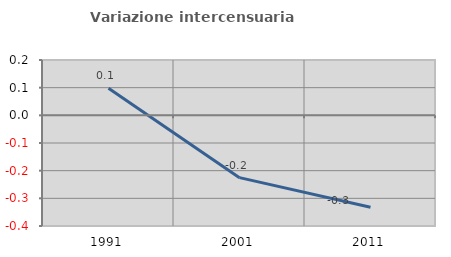
| Category | Variazione intercensuaria annua |
|---|---|
| 1991.0 | 0.098 |
| 2001.0 | -0.225 |
| 2011.0 | -0.332 |